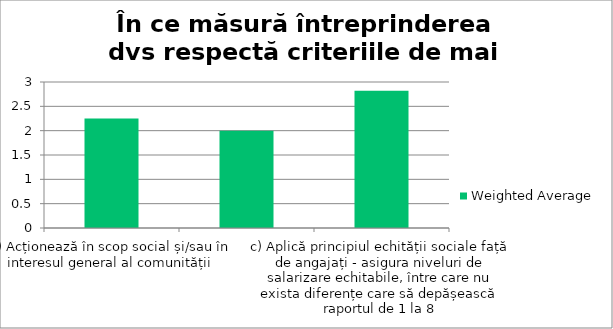
| Category | Weighted Average |
|---|---|
| a) Acționează în scop social și/sau în interesul general al comunității | 2.25 |
| b) Alocă parte din profitul realizat scopului social și rezervei statutare | 2 |
| c) Aplică principiul echității sociale față de angajați - asigura niveluri de salarizare echitabile, între care nu exista diferențe care să depășească raportul de 1 la 8 | 2.82 |